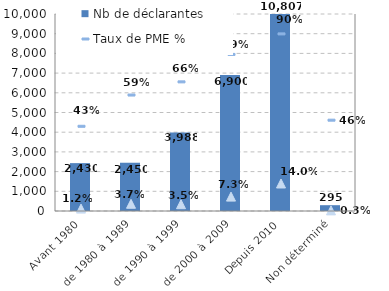
| Category | Nb de déclarantes |
|---|---|
| Avant 1980 | 2430 |
| de 1980 à 1989 | 2450 |
| de 1990 à 1999 | 3988 |
| de 2000 à 2009 | 6900 |
| Depuis 2010 | 10807 |
| Non déterminé | 295 |